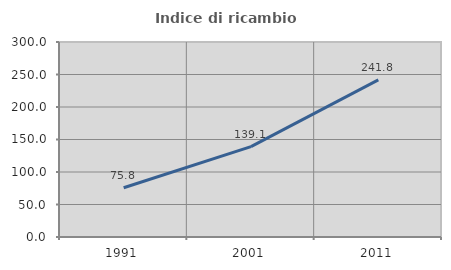
| Category | Indice di ricambio occupazionale  |
|---|---|
| 1991.0 | 75.806 |
| 2001.0 | 139.13 |
| 2011.0 | 241.791 |